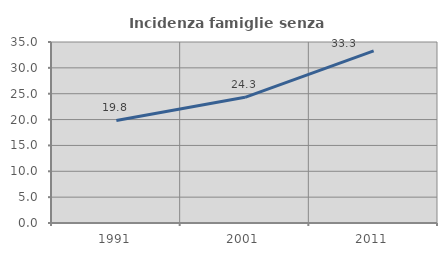
| Category | Incidenza famiglie senza nuclei |
|---|---|
| 1991.0 | 19.825 |
| 2001.0 | 24.308 |
| 2011.0 | 33.292 |